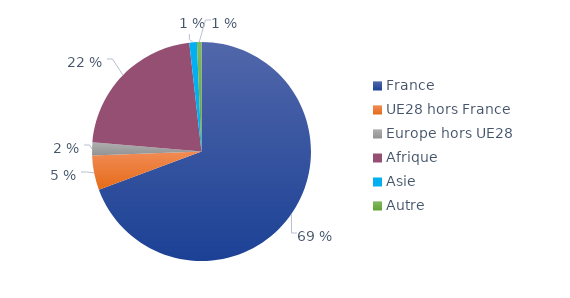
| Category | Series 0 |
|---|---|
| France | 0.69 |
| UE28 hors France | 0.05 |
| Europe hors UE28 | 0.019 |
| Afrique | 0.218 |
| Asie | 0.011 |
| Autre | 0.007 |